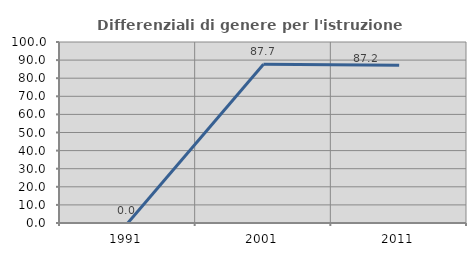
| Category | Differenziali di genere per l'istruzione superiore |
|---|---|
| 1991.0 | 0 |
| 2001.0 | 87.662 |
| 2011.0 | 87.179 |